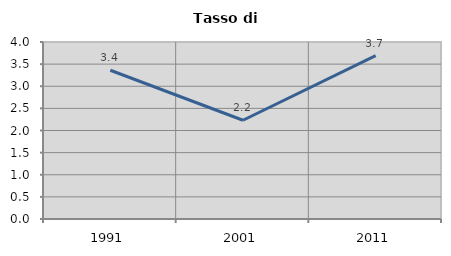
| Category | Tasso di disoccupazione   |
|---|---|
| 1991.0 | 3.361 |
| 2001.0 | 2.232 |
| 2011.0 | 3.69 |